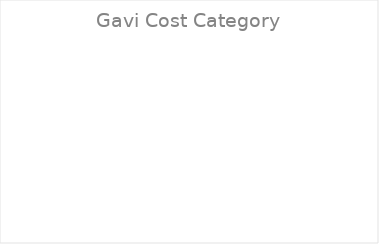
| Category | TOTAL |
|---|---|
| 1.0 | 0 |
| 2.0 | 0 |
| 3.0 | 0 |
| 4.0 | 0 |
| 5.0 | 0 |
| 6.0 | 0 |
| 7.0 | 0 |
| 8.0 | 0 |
| 9.0 | 0 |
| 10.0 | 0 |